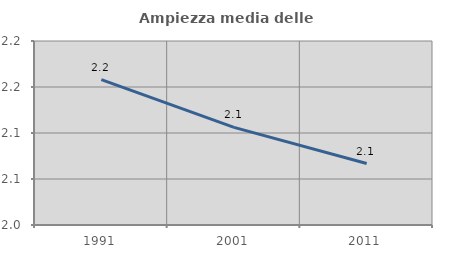
| Category | Ampiezza media delle famiglie |
|---|---|
| 1991.0 | 2.158 |
| 2001.0 | 2.106 |
| 2011.0 | 2.067 |